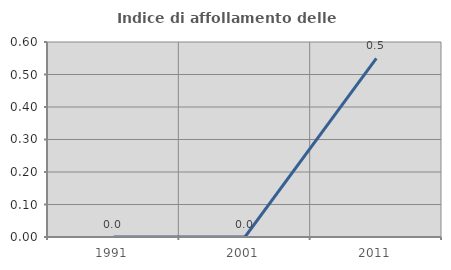
| Category | Indice di affollamento delle abitazioni  |
|---|---|
| 1991.0 | 0 |
| 2001.0 | 0 |
| 2011.0 | 0.549 |